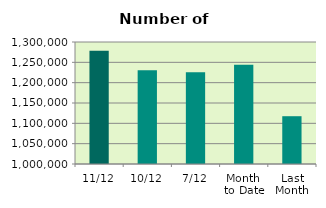
| Category | Series 0 |
|---|---|
| 11/12 | 1278370 |
| 10/12 | 1230752 |
| 7/12 | 1225490 |
| Month 
to Date | 1244310.571 |
| Last
Month | 1117514.364 |